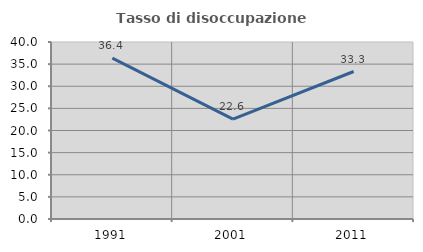
| Category | Tasso di disoccupazione giovanile  |
|---|---|
| 1991.0 | 36.364 |
| 2001.0 | 22.581 |
| 2011.0 | 33.333 |